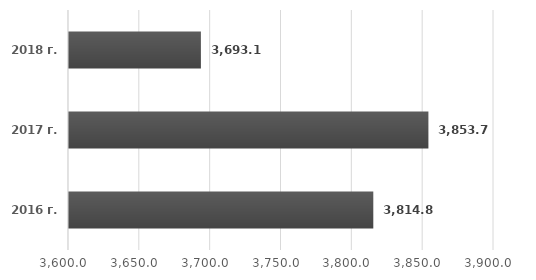
| Category | Series 0 |
|---|---|
| 2016 г. | 3814.8 |
| 2017 г. | 3853.7 |
| 2018 г. | 3693.1 |